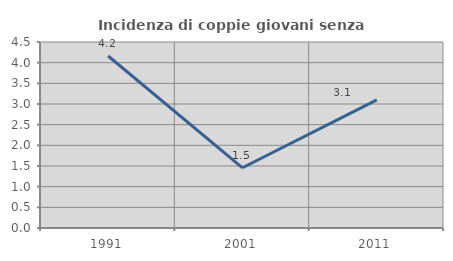
| Category | Incidenza di coppie giovani senza figli |
|---|---|
| 1991.0 | 4.161 |
| 2001.0 | 1.457 |
| 2011.0 | 3.098 |